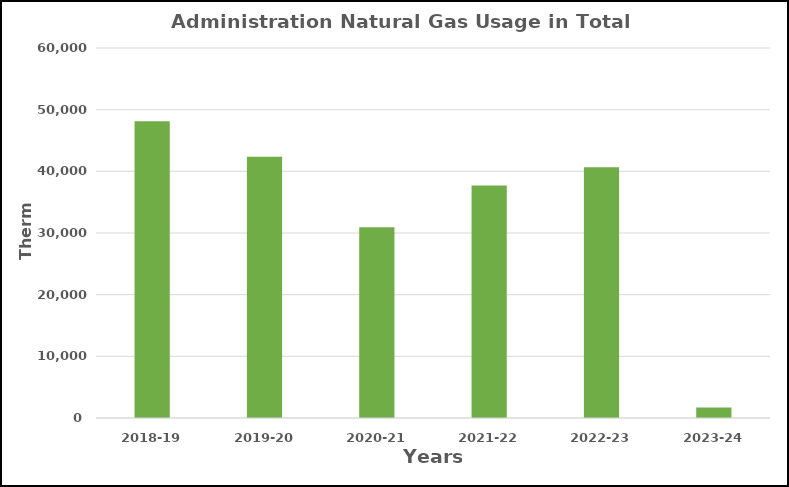
| Category | Series 0 |
|---|---|
| 2018-19 | 48134 |
| 2019-20 | 42384 |
| 2020-21 | 30927 |
| 2021-22 | 37707 |
| 2022-23 | 40642 |
| 2023-24 | 1719 |